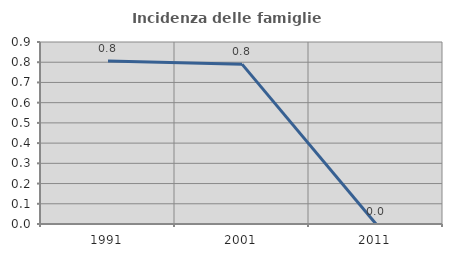
| Category | Incidenza delle famiglie numerose |
|---|---|
| 1991.0 | 0.806 |
| 2001.0 | 0.791 |
| 2011.0 | 0 |